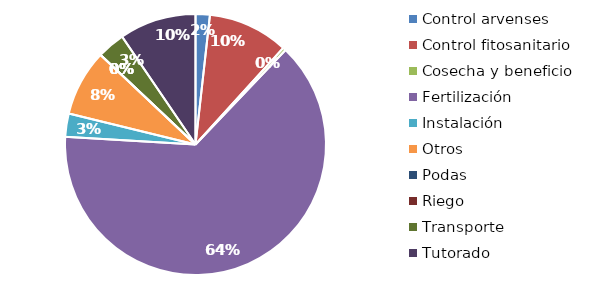
| Category | Valor |
|---|---|
| Control arvenses | 1149096 |
| Control fitosanitario | 6479042 |
| Cosecha y beneficio | 247426.962 |
| Fertilización | 41485203 |
| Instalación | 1870887.252 |
| Otros | 5340303 |
| Podas | 0 |
| Riego | 0 |
| Transporte | 2237146 |
| Tutorado | 6186000 |